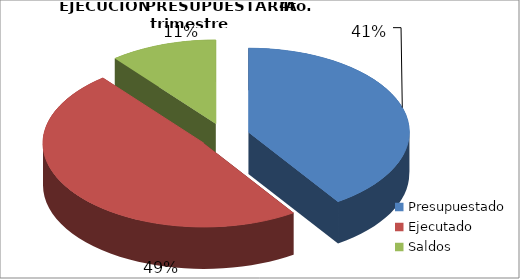
| Category | Series 0 |
|---|---|
| Presupuestado | 66671971311 |
| Ejecutado | 79823457865 |
| Saldos | 17731815021 |